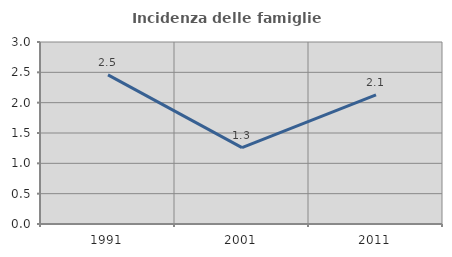
| Category | Incidenza delle famiglie numerose |
|---|---|
| 1991.0 | 2.457 |
| 2001.0 | 1.258 |
| 2011.0 | 2.128 |